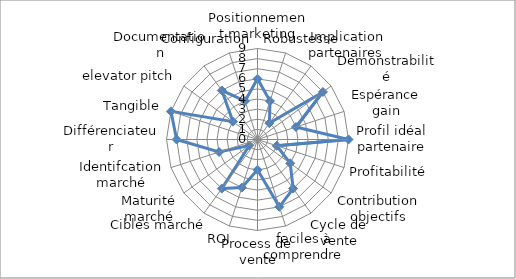
| Category | Series 0 |
|---|---|
| Positionnement marketing | 6 |
| Robustesse | 4 |
| Implication partenaires | 2 |
| Demonstrabilité | 8 |
| Espérance gain | 4 |
| Profil idéal partenaire | 9 |
| Profitabilité | 2 |
| Contribution objectifs | 4 |
| Cycle de vente | 6 |
| faciles à comprendre | 7 |
| Process de vente | 3 |
| ROI | 5 |
| Cibles marché | 6 |
| Maturité marché | 1 |
| Identifcation marché | 4 |
| Différenciateur | 8 |
| Tangible | 9 |
| elevator pitch | 3 |
| Documentation | 6 |
| Configuration | 4 |